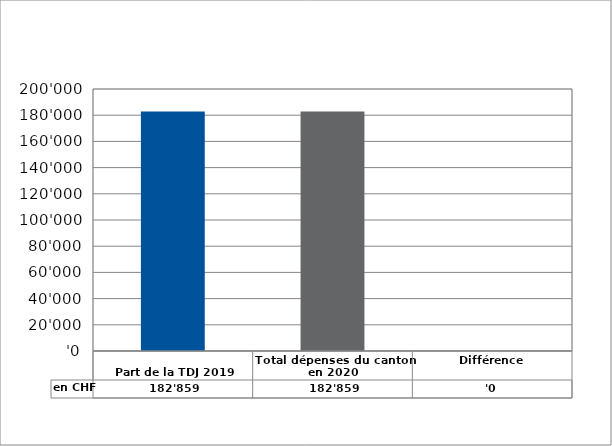
| Category | en CHF |
|---|---|
| 
Part de la TDJ 2019

 | 182859 |
| Total dépenses du canton en 2020 | 182859 |
| Différence | 0 |